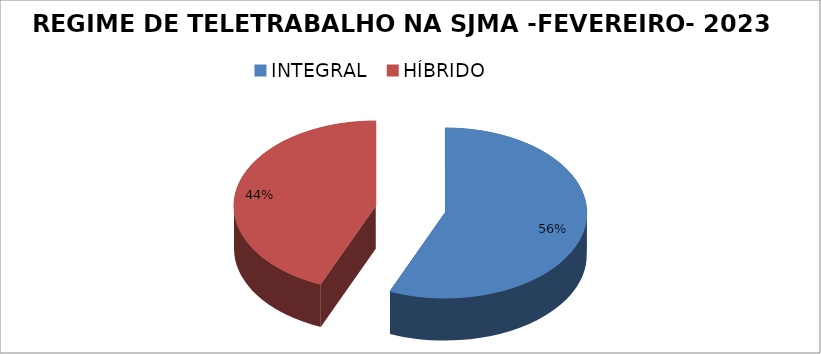
| Category | Series 0 |
|---|---|
| INTEGRAL | 80 |
| HÍBRIDO | 62 |